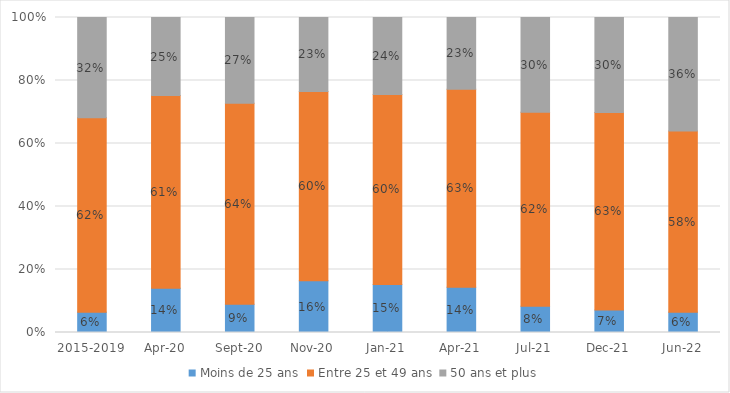
| Category | Moins de 25 ans | Entre 25 et 49 ans | 50 ans et plus |
|---|---|---|---|
| 2015-2019 | 0.064 | 0.617 | 0.318 |
| avr-20 | 0.14 | 0.612 | 0.248 |
| sept-20 | 0.089 | 0.639 | 0.272 |
| nov-20 | 0.164 | 0.601 | 0.235 |
| janv-21 | 0.152 | 0.603 | 0.244 |
| avr-21 | 0.144 | 0.629 | 0.228 |
| juil-21 | 0.083 | 0.616 | 0.301 |
| déc-21 | 0.071 | 0.627 | 0.302 |
| juin-22 | 0.065 | 0.575 | 0.36 |